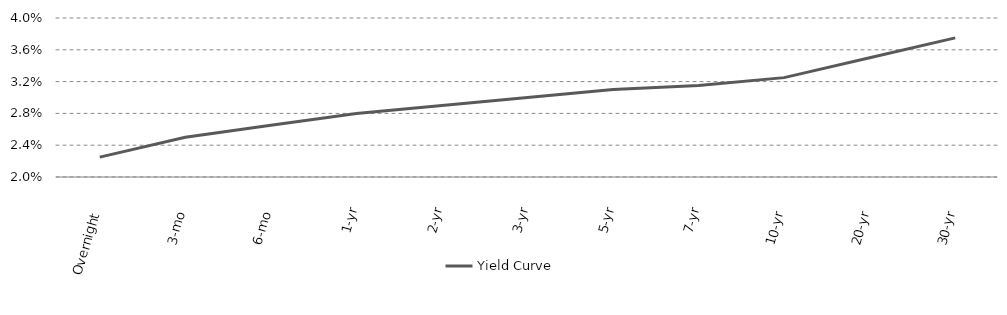
| Category | Yield Curve |
|---|---|
| Overnight | 0.022 |
| 3-mo | 0.025 |
| 6-mo | 0.026 |
| 1-yr | 0.028 |
| 2-yr | 0.029 |
| 3-yr | 0.03 |
| 5-yr | 0.031 |
| 7-yr | 0.032 |
| 10-yr | 0.032 |
| 20-yr | 0.035 |
| 30-yr | 0.038 |